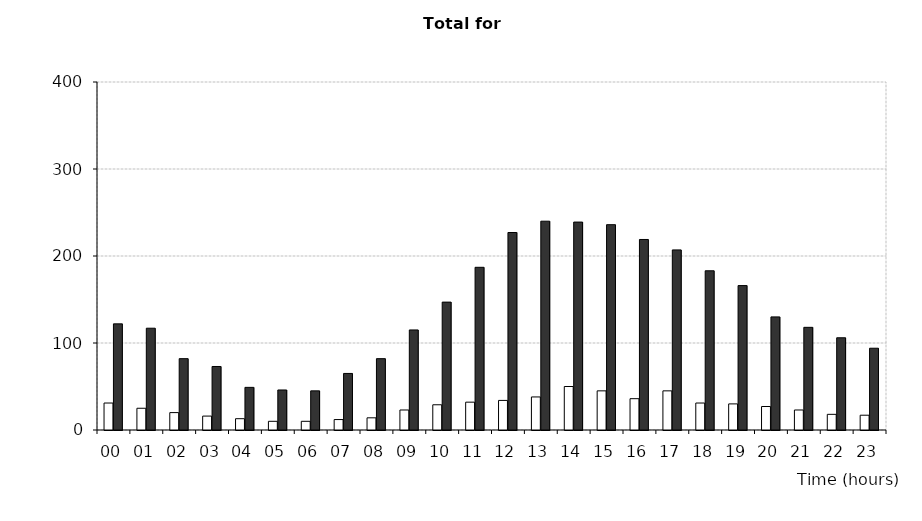
| Category | Fatal/Serious | All severities |
|---|---|---|
| 00 | 31 | 122 |
| 01 | 25 | 117 |
| 02 | 20 | 82 |
| 03 | 16 | 73 |
| 04 | 13 | 49 |
| 05 | 10 | 46 |
| 06 | 10 | 45 |
| 07 | 12 | 65 |
| 08 | 14 | 82 |
| 09 | 23 | 115 |
| 10 | 29 | 147 |
| 11 | 32 | 187 |
| 12 | 34 | 227 |
| 13 | 38 | 240 |
| 14 | 50 | 239 |
| 15 | 45 | 236 |
| 16 | 36 | 219 |
| 17 | 45 | 207 |
| 18 | 31 | 183 |
| 19 | 30 | 166 |
| 20 | 27 | 130 |
| 21 | 23 | 118 |
| 22 | 18 | 106 |
| 23 | 17 | 94 |